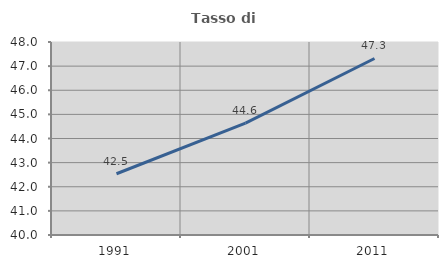
| Category | Tasso di occupazione   |
|---|---|
| 1991.0 | 42.539 |
| 2001.0 | 44.635 |
| 2011.0 | 47.317 |